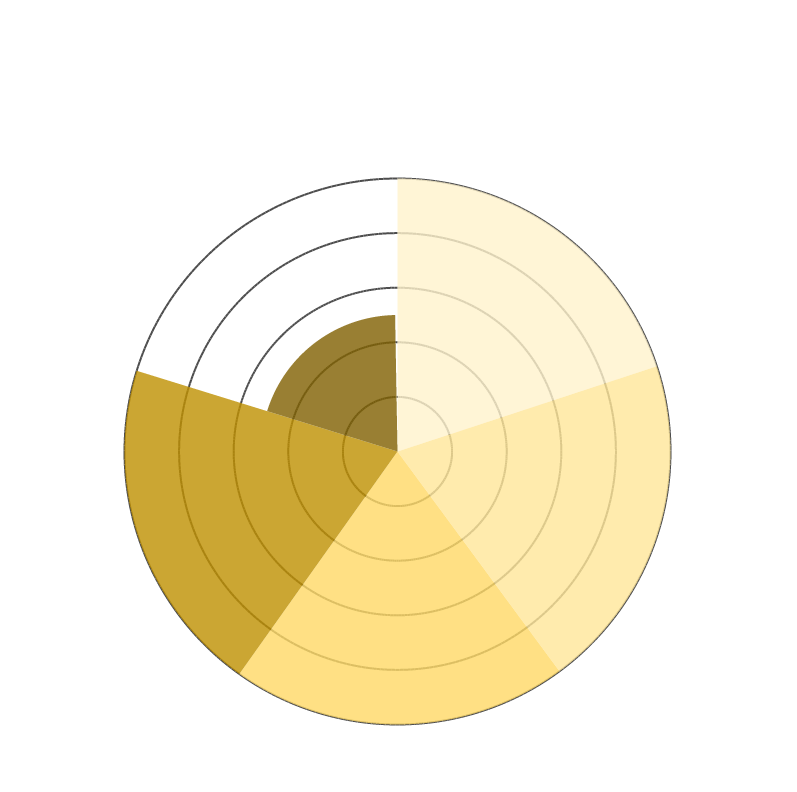
| Category | Lokale vraag CO2 < 5 km | Lokale vraag bio-LNG/CNG | Lokale vraag groengas  < 5 km | Lokale vraag biogas  < 5 km | Drukbeperking op openbare gasnet |
|---|---|---|---|---|---|
| 0 | 10 | 0 | 0 | 0 | 0 |
| 1 | 10 | 0 | 0 | 0 | 0 |
| 2 | 10 | 0 | 0 | 0 | 0 |
| 3 | 10 | 0 | 0 | 0 | 0 |
| 4 | 10 | 0 | 0 | 0 | 0 |
| 5 | 10 | 0 | 0 | 0 | 0 |
| 6 | 10 | 0 | 0 | 0 | 0 |
| 7 | 10 | 0 | 0 | 0 | 0 |
| 8 | 10 | 0 | 0 | 0 | 0 |
| 9 | 10 | 0 | 0 | 0 | 0 |
| 10 | 10 | 0 | 0 | 0 | 0 |
| 11 | 10 | 0 | 0 | 0 | 0 |
| 12 | 10 | 0 | 0 | 0 | 0 |
| 13 | 10 | 0 | 0 | 0 | 0 |
| 14 | 10 | 0 | 0 | 0 | 0 |
| 15 | 10 | 0 | 0 | 0 | 0 |
| 16 | 10 | 0 | 0 | 0 | 0 |
| 17 | 10 | 0 | 0 | 0 | 0 |
| 18 | 10 | 0 | 0 | 0 | 0 |
| 19 | 10 | 0 | 0 | 0 | 0 |
| 20 | 10 | 0 | 0 | 0 | 0 |
| 21 | 10 | 0 | 0 | 0 | 0 |
| 22 | 10 | 0 | 0 | 0 | 0 |
| 23 | 10 | 0 | 0 | 0 | 0 |
| 24 | 10 | 0 | 0 | 0 | 0 |
| 25 | 10 | 0 | 0 | 0 | 0 |
| 26 | 10 | 0 | 0 | 0 | 0 |
| 27 | 10 | 0 | 0 | 0 | 0 |
| 28 | 10 | 0 | 0 | 0 | 0 |
| 29 | 10 | 0 | 0 | 0 | 0 |
| 30 | 10 | 0 | 0 | 0 | 0 |
| 31 | 10 | 0 | 0 | 0 | 0 |
| 32 | 10 | 0 | 0 | 0 | 0 |
| 33 | 10 | 0 | 0 | 0 | 0 |
| 34 | 10 | 0 | 0 | 0 | 0 |
| 35 | 10 | 0 | 0 | 0 | 0 |
| 36 | 10 | 0 | 0 | 0 | 0 |
| 37 | 10 | 0 | 0 | 0 | 0 |
| 38 | 10 | 0 | 0 | 0 | 0 |
| 39 | 10 | 0 | 0 | 0 | 0 |
| 40 | 10 | 0 | 0 | 0 | 0 |
| 41 | 10 | 0 | 0 | 0 | 0 |
| 42 | 10 | 0 | 0 | 0 | 0 |
| 43 | 10 | 0 | 0 | 0 | 0 |
| 44 | 10 | 0 | 0 | 0 | 0 |
| 45 | 10 | 0 | 0 | 0 | 0 |
| 46 | 10 | 0 | 0 | 0 | 0 |
| 47 | 10 | 0 | 0 | 0 | 0 |
| 48 | 10 | 0 | 0 | 0 | 0 |
| 49 | 10 | 0 | 0 | 0 | 0 |
| 50 | 10 | 0 | 0 | 0 | 0 |
| 51 | 10 | 0 | 0 | 0 | 0 |
| 52 | 10 | 0 | 0 | 0 | 0 |
| 53 | 10 | 0 | 0 | 0 | 0 |
| 54 | 10 | 0 | 0 | 0 | 0 |
| 55 | 10 | 0 | 0 | 0 | 0 |
| 56 | 10 | 0 | 0 | 0 | 0 |
| 57 | 10 | 0 | 0 | 0 | 0 |
| 58 | 10 | 0 | 0 | 0 | 0 |
| 59 | 10 | 0 | 0 | 0 | 0 |
| 60 | 10 | 0 | 0 | 0 | 0 |
| 61 | 10 | 0 | 0 | 0 | 0 |
| 62 | 10 | 0 | 0 | 0 | 0 |
| 63 | 10 | 0 | 0 | 0 | 0 |
| 64 | 10 | 0 | 0 | 0 | 0 |
| 65 | 10 | 0 | 0 | 0 | 0 |
| 66 | 10 | 0 | 0 | 0 | 0 |
| 67 | 10 | 0 | 0 | 0 | 0 |
| 68 | 10 | 0 | 0 | 0 | 0 |
| 69 | 10 | 0 | 0 | 0 | 0 |
| 70 | 10 | 0 | 0 | 0 | 0 |
| 71 | 10 | 0 | 0 | 0 | 0 |
| 72 | 10 | 10 | 0 | 0 | 0 |
| 73 | 0 | 10 | 0 | 0 | 0 |
| 74 | 0 | 10 | 0 | 0 | 0 |
| 75 | 0 | 10 | 0 | 0 | 0 |
| 76 | 0 | 10 | 0 | 0 | 0 |
| 77 | 0 | 10 | 0 | 0 | 0 |
| 78 | 0 | 10 | 0 | 0 | 0 |
| 79 | 0 | 10 | 0 | 0 | 0 |
| 80 | 0 | 10 | 0 | 0 | 0 |
| 81 | 0 | 10 | 0 | 0 | 0 |
| 82 | 0 | 10 | 0 | 0 | 0 |
| 83 | 0 | 10 | 0 | 0 | 0 |
| 84 | 0 | 10 | 0 | 0 | 0 |
| 85 | 0 | 10 | 0 | 0 | 0 |
| 86 | 0 | 10 | 0 | 0 | 0 |
| 87 | 0 | 10 | 0 | 0 | 0 |
| 88 | 0 | 10 | 0 | 0 | 0 |
| 89 | 0 | 10 | 0 | 0 | 0 |
| 90 | 0 | 10 | 0 | 0 | 0 |
| 91 | 0 | 10 | 0 | 0 | 0 |
| 92 | 0 | 10 | 0 | 0 | 0 |
| 93 | 0 | 10 | 0 | 0 | 0 |
| 94 | 0 | 10 | 0 | 0 | 0 |
| 95 | 0 | 10 | 0 | 0 | 0 |
| 96 | 0 | 10 | 0 | 0 | 0 |
| 97 | 0 | 10 | 0 | 0 | 0 |
| 98 | 0 | 10 | 0 | 0 | 0 |
| 99 | 0 | 10 | 0 | 0 | 0 |
| 100 | 0 | 10 | 0 | 0 | 0 |
| 101 | 0 | 10 | 0 | 0 | 0 |
| 102 | 0 | 10 | 0 | 0 | 0 |
| 103 | 0 | 10 | 0 | 0 | 0 |
| 104 | 0 | 10 | 0 | 0 | 0 |
| 105 | 0 | 10 | 0 | 0 | 0 |
| 106 | 0 | 10 | 0 | 0 | 0 |
| 107 | 0 | 10 | 0 | 0 | 0 |
| 108 | 0 | 10 | 0 | 0 | 0 |
| 109 | 0 | 10 | 0 | 0 | 0 |
| 110 | 0 | 10 | 0 | 0 | 0 |
| 111 | 0 | 10 | 0 | 0 | 0 |
| 112 | 0 | 10 | 0 | 0 | 0 |
| 113 | 0 | 10 | 0 | 0 | 0 |
| 114 | 0 | 10 | 0 | 0 | 0 |
| 115 | 0 | 10 | 0 | 0 | 0 |
| 116 | 0 | 10 | 0 | 0 | 0 |
| 117 | 0 | 10 | 0 | 0 | 0 |
| 118 | 0 | 10 | 0 | 0 | 0 |
| 119 | 0 | 10 | 0 | 0 | 0 |
| 120 | 0 | 10 | 0 | 0 | 0 |
| 121 | 0 | 10 | 0 | 0 | 0 |
| 122 | 0 | 10 | 0 | 0 | 0 |
| 123 | 0 | 10 | 0 | 0 | 0 |
| 124 | 0 | 10 | 0 | 0 | 0 |
| 125 | 0 | 10 | 0 | 0 | 0 |
| 126 | 0 | 10 | 0 | 0 | 0 |
| 127 | 0 | 10 | 0 | 0 | 0 |
| 128 | 0 | 10 | 0 | 0 | 0 |
| 129 | 0 | 10 | 0 | 0 | 0 |
| 130 | 0 | 10 | 0 | 0 | 0 |
| 131 | 0 | 10 | 0 | 0 | 0 |
| 132 | 0 | 10 | 0 | 0 | 0 |
| 133 | 0 | 10 | 0 | 0 | 0 |
| 134 | 0 | 10 | 0 | 0 | 0 |
| 135 | 0 | 10 | 0 | 0 | 0 |
| 136 | 0 | 10 | 0 | 0 | 0 |
| 137 | 0 | 10 | 0 | 0 | 0 |
| 138 | 0 | 10 | 0 | 0 | 0 |
| 139 | 0 | 10 | 0 | 0 | 0 |
| 140 | 0 | 10 | 0 | 0 | 0 |
| 141 | 0 | 10 | 0 | 0 | 0 |
| 142 | 0 | 10 | 0 | 0 | 0 |
| 143 | 0 | 10 | 0 | 0 | 0 |
| 144 | 0 | 10 | 10 | 0 | 0 |
| 145 | 0 | 0 | 10 | 0 | 0 |
| 146 | 0 | 0 | 10 | 0 | 0 |
| 147 | 0 | 0 | 10 | 0 | 0 |
| 148 | 0 | 0 | 10 | 0 | 0 |
| 149 | 0 | 0 | 10 | 0 | 0 |
| 150 | 0 | 0 | 10 | 0 | 0 |
| 151 | 0 | 0 | 10 | 0 | 0 |
| 152 | 0 | 0 | 10 | 0 | 0 |
| 153 | 0 | 0 | 10 | 0 | 0 |
| 154 | 0 | 0 | 10 | 0 | 0 |
| 155 | 0 | 0 | 10 | 0 | 0 |
| 156 | 0 | 0 | 10 | 0 | 0 |
| 157 | 0 | 0 | 10 | 0 | 0 |
| 158 | 0 | 0 | 10 | 0 | 0 |
| 159 | 0 | 0 | 10 | 0 | 0 |
| 160 | 0 | 0 | 10 | 0 | 0 |
| 161 | 0 | 0 | 10 | 0 | 0 |
| 162 | 0 | 0 | 10 | 0 | 0 |
| 163 | 0 | 0 | 10 | 0 | 0 |
| 164 | 0 | 0 | 10 | 0 | 0 |
| 165 | 0 | 0 | 10 | 0 | 0 |
| 166 | 0 | 0 | 10 | 0 | 0 |
| 167 | 0 | 0 | 10 | 0 | 0 |
| 168 | 0 | 0 | 10 | 0 | 0 |
| 169 | 0 | 0 | 10 | 0 | 0 |
| 170 | 0 | 0 | 10 | 0 | 0 |
| 171 | 0 | 0 | 10 | 0 | 0 |
| 172 | 0 | 0 | 10 | 0 | 0 |
| 173 | 0 | 0 | 10 | 0 | 0 |
| 174 | 0 | 0 | 10 | 0 | 0 |
| 175 | 0 | 0 | 10 | 0 | 0 |
| 176 | 0 | 0 | 10 | 0 | 0 |
| 177 | 0 | 0 | 10 | 0 | 0 |
| 178 | 0 | 0 | 10 | 0 | 0 |
| 179 | 0 | 0 | 10 | 0 | 0 |
| 180 | 0 | 0 | 10 | 0 | 0 |
| 181 | 0 | 0 | 10 | 0 | 0 |
| 182 | 0 | 0 | 10 | 0 | 0 |
| 183 | 0 | 0 | 10 | 0 | 0 |
| 184 | 0 | 0 | 10 | 0 | 0 |
| 185 | 0 | 0 | 10 | 0 | 0 |
| 186 | 0 | 0 | 10 | 0 | 0 |
| 187 | 0 | 0 | 10 | 0 | 0 |
| 188 | 0 | 0 | 10 | 0 | 0 |
| 189 | 0 | 0 | 10 | 0 | 0 |
| 190 | 0 | 0 | 10 | 0 | 0 |
| 191 | 0 | 0 | 10 | 0 | 0 |
| 192 | 0 | 0 | 10 | 0 | 0 |
| 193 | 0 | 0 | 10 | 0 | 0 |
| 194 | 0 | 0 | 10 | 0 | 0 |
| 195 | 0 | 0 | 10 | 0 | 0 |
| 196 | 0 | 0 | 10 | 0 | 0 |
| 197 | 0 | 0 | 10 | 0 | 0 |
| 198 | 0 | 0 | 10 | 0 | 0 |
| 199 | 0 | 0 | 10 | 0 | 0 |
| 200 | 0 | 0 | 10 | 0 | 0 |
| 201 | 0 | 0 | 10 | 0 | 0 |
| 202 | 0 | 0 | 10 | 0 | 0 |
| 203 | 0 | 0 | 10 | 0 | 0 |
| 204 | 0 | 0 | 10 | 0 | 0 |
| 205 | 0 | 0 | 10 | 0 | 0 |
| 206 | 0 | 0 | 10 | 0 | 0 |
| 207 | 0 | 0 | 10 | 0 | 0 |
| 208 | 0 | 0 | 10 | 0 | 0 |
| 209 | 0 | 0 | 10 | 0 | 0 |
| 210 | 0 | 0 | 10 | 0 | 0 |
| 211 | 0 | 0 | 10 | 0 | 0 |
| 212 | 0 | 0 | 10 | 0 | 0 |
| 213 | 0 | 0 | 10 | 0 | 0 |
| 214 | 0 | 0 | 10 | 0 | 0 |
| 215 | 0 | 0 | 10 | 0 | 0 |
| 216 | 0 | 0 | 10 | 10 | 0 |
| 217 | 0 | 0 | 0 | 10 | 0 |
| 218 | 0 | 0 | 0 | 10 | 0 |
| 219 | 0 | 0 | 0 | 10 | 0 |
| 220 | 0 | 0 | 0 | 10 | 0 |
| 221 | 0 | 0 | 0 | 10 | 0 |
| 222 | 0 | 0 | 0 | 10 | 0 |
| 223 | 0 | 0 | 0 | 10 | 0 |
| 224 | 0 | 0 | 0 | 10 | 0 |
| 225 | 0 | 0 | 0 | 10 | 0 |
| 226 | 0 | 0 | 0 | 10 | 0 |
| 227 | 0 | 0 | 0 | 10 | 0 |
| 228 | 0 | 0 | 0 | 10 | 0 |
| 229 | 0 | 0 | 0 | 10 | 0 |
| 230 | 0 | 0 | 0 | 10 | 0 |
| 231 | 0 | 0 | 0 | 10 | 0 |
| 232 | 0 | 0 | 0 | 10 | 0 |
| 233 | 0 | 0 | 0 | 10 | 0 |
| 234 | 0 | 0 | 0 | 10 | 0 |
| 235 | 0 | 0 | 0 | 10 | 0 |
| 236 | 0 | 0 | 0 | 10 | 0 |
| 237 | 0 | 0 | 0 | 10 | 0 |
| 238 | 0 | 0 | 0 | 10 | 0 |
| 239 | 0 | 0 | 0 | 10 | 0 |
| 240 | 0 | 0 | 0 | 10 | 0 |
| 241 | 0 | 0 | 0 | 10 | 0 |
| 242 | 0 | 0 | 0 | 10 | 0 |
| 243 | 0 | 0 | 0 | 10 | 0 |
| 244 | 0 | 0 | 0 | 10 | 0 |
| 245 | 0 | 0 | 0 | 10 | 0 |
| 246 | 0 | 0 | 0 | 10 | 0 |
| 247 | 0 | 0 | 0 | 10 | 0 |
| 248 | 0 | 0 | 0 | 10 | 0 |
| 249 | 0 | 0 | 0 | 10 | 0 |
| 250 | 0 | 0 | 0 | 10 | 0 |
| 251 | 0 | 0 | 0 | 10 | 0 |
| 252 | 0 | 0 | 0 | 10 | 0 |
| 253 | 0 | 0 | 0 | 10 | 0 |
| 254 | 0 | 0 | 0 | 10 | 0 |
| 255 | 0 | 0 | 0 | 10 | 0 |
| 256 | 0 | 0 | 0 | 10 | 0 |
| 257 | 0 | 0 | 0 | 10 | 0 |
| 258 | 0 | 0 | 0 | 10 | 0 |
| 259 | 0 | 0 | 0 | 10 | 0 |
| 260 | 0 | 0 | 0 | 10 | 0 |
| 261 | 0 | 0 | 0 | 10 | 0 |
| 262 | 0 | 0 | 0 | 10 | 0 |
| 263 | 0 | 0 | 0 | 10 | 0 |
| 264 | 0 | 0 | 0 | 10 | 0 |
| 265 | 0 | 0 | 0 | 10 | 0 |
| 266 | 0 | 0 | 0 | 10 | 0 |
| 267 | 0 | 0 | 0 | 10 | 0 |
| 268 | 0 | 0 | 0 | 10 | 0 |
| 269 | 0 | 0 | 0 | 10 | 0 |
| 270 | 0 | 0 | 0 | 10 | 0 |
| 271 | 0 | 0 | 0 | 10 | 0 |
| 272 | 0 | 0 | 0 | 10 | 0 |
| 273 | 0 | 0 | 0 | 10 | 0 |
| 274 | 0 | 0 | 0 | 10 | 0 |
| 275 | 0 | 0 | 0 | 10 | 0 |
| 276 | 0 | 0 | 0 | 10 | 0 |
| 277 | 0 | 0 | 0 | 10 | 0 |
| 278 | 0 | 0 | 0 | 10 | 0 |
| 279 | 0 | 0 | 0 | 10 | 0 |
| 280 | 0 | 0 | 0 | 10 | 0 |
| 281 | 0 | 0 | 0 | 10 | 0 |
| 282 | 0 | 0 | 0 | 10 | 0 |
| 283 | 0 | 0 | 0 | 10 | 0 |
| 284 | 0 | 0 | 0 | 10 | 0 |
| 285 | 0 | 0 | 0 | 10 | 0 |
| 286 | 0 | 0 | 0 | 10 | 0 |
| 287 | 0 | 0 | 0 | 10 | 0 |
| 288 | 0 | 0 | 0 | 10 | 0 |
| 289 | 0 | 0 | 0 | 0 | 0 |
| 290 | 0 | 0 | 0 | 0 | 0 |
| 291 | 0 | 0 | 0 | 0 | 0 |
| 292 | 0 | 0 | 0 | 0 | 0 |
| 293 | 0 | 0 | 0 | 0 | 0 |
| 294 | 0 | 0 | 0 | 0 | 0 |
| 295 | 0 | 0 | 0 | 0 | 0 |
| 296 | 0 | 0 | 0 | 0 | 0 |
| 297 | 0 | 0 | 0 | 0 | 0 |
| 298 | 0 | 0 | 0 | 0 | 0 |
| 299 | 0 | 0 | 0 | 0 | 0 |
| 300 | 0 | 0 | 0 | 0 | 0 |
| 301 | 0 | 0 | 0 | 0 | 0 |
| 302 | 0 | 0 | 0 | 0 | 0 |
| 303 | 0 | 0 | 0 | 0 | 0 |
| 304 | 0 | 0 | 0 | 0 | 0 |
| 305 | 0 | 0 | 0 | 0 | 0 |
| 306 | 0 | 0 | 0 | 0 | 0 |
| 307 | 0 | 0 | 0 | 0 | 0 |
| 308 | 0 | 0 | 0 | 0 | 0 |
| 309 | 0 | 0 | 0 | 0 | 0 |
| 310 | 0 | 0 | 0 | 0 | 0 |
| 311 | 0 | 0 | 0 | 0 | 0 |
| 312 | 0 | 0 | 0 | 0 | 0 |
| 313 | 0 | 0 | 0 | 0 | 0 |
| 314 | 0 | 0 | 0 | 0 | 0 |
| 315 | 0 | 0 | 0 | 0 | 0 |
| 316 | 0 | 0 | 0 | 0 | 0 |
| 317 | 0 | 0 | 0 | 0 | 0 |
| 318 | 0 | 0 | 0 | 0 | 0 |
| 319 | 0 | 0 | 0 | 0 | 0 |
| 320 | 0 | 0 | 0 | 0 | 0 |
| 321 | 0 | 0 | 0 | 0 | 0 |
| 322 | 0 | 0 | 0 | 0 | 0 |
| 323 | 0 | 0 | 0 | 0 | 0 |
| 324 | 0 | 0 | 0 | 0 | 0 |
| 325 | 0 | 0 | 0 | 0 | 0 |
| 326 | 0 | 0 | 0 | 0 | 0 |
| 327 | 0 | 0 | 0 | 0 | 0 |
| 328 | 0 | 0 | 0 | 0 | 0 |
| 329 | 0 | 0 | 0 | 0 | 0 |
| 330 | 0 | 0 | 0 | 0 | 0 |
| 331 | 0 | 0 | 0 | 0 | 0 |
| 332 | 0 | 0 | 0 | 0 | 0 |
| 333 | 0 | 0 | 0 | 0 | 0 |
| 334 | 0 | 0 | 0 | 0 | 0 |
| 335 | 0 | 0 | 0 | 0 | 0 |
| 336 | 0 | 0 | 0 | 0 | 0 |
| 337 | 0 | 0 | 0 | 0 | 0 |
| 338 | 0 | 0 | 0 | 0 | 0 |
| 339 | 0 | 0 | 0 | 0 | 0 |
| 340 | 0 | 0 | 0 | 0 | 0 |
| 341 | 0 | 0 | 0 | 0 | 0 |
| 342 | 0 | 0 | 0 | 0 | 0 |
| 343 | 0 | 0 | 0 | 0 | 0 |
| 344 | 0 | 0 | 0 | 0 | 0 |
| 345 | 0 | 0 | 0 | 0 | 0 |
| 346 | 0 | 0 | 0 | 0 | 0 |
| 347 | 0 | 0 | 0 | 0 | 0 |
| 348 | 0 | 0 | 0 | 0 | 0 |
| 349 | 0 | 0 | 0 | 0 | 0 |
| 350 | 0 | 0 | 0 | 0 | 0 |
| 351 | 0 | 0 | 0 | 0 | 0 |
| 352 | 0 | 0 | 0 | 0 | 0 |
| 353 | 0 | 0 | 0 | 0 | 0 |
| 354 | 0 | 0 | 0 | 0 | 0 |
| 355 | 0 | 0 | 0 | 0 | 0 |
| 356 | 0 | 0 | 0 | 0 | 0 |
| 357 | 0 | 0 | 0 | 0 | 0 |
| 358 | 0 | 0 | 0 | 0 | 0 |
| 359 | 0 | 0 | 0 | 0 | 0 |
| 360 | 0 | 0 | 0 | 0 | 10 |